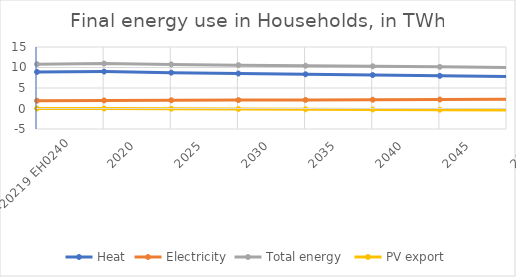
| Category | Heat | Electricity | Total energy  | PV export |
|---|---|---|---|---|
| 2010-20219 EH0240 | 8.92 | 1.9 | 10.82 | 0 |
| 2020 | 9.006 | 1.961 | 10.967 | -0.013 |
| 2025 | 8.745 | 2.003 | 10.749 | -0.057 |
| 2030 | 8.53 | 2.049 | 10.578 | -0.119 |
| 2035 | 8.344 | 2.096 | 10.439 | -0.193 |
| 2040 | 8.158 | 2.143 | 10.301 | -0.236 |
| 2045 | 7.972 | 2.19 | 10.162 | -0.294 |
| 2050 | 7.786 | 2.237 | 10.023 | -0.352 |